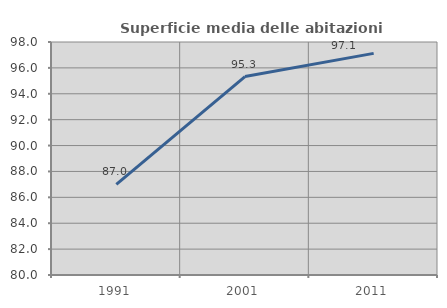
| Category | Superficie media delle abitazioni occupate |
|---|---|
| 1991.0 | 87.004 |
| 2001.0 | 95.328 |
| 2011.0 | 97.123 |